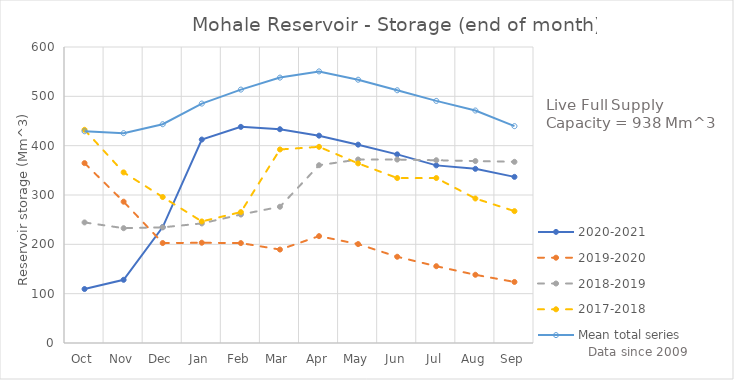
| Category | 2020-2021 | 2019-2020 | 2018-2019 | 2017-2018 | Mean total series |
|---|---|---|---|---|---|
| Oct | 109.398 | 364.62 | 244.4 | 432.2 | 429.191 |
| Nov | 128.09 | 286.44 | 232.72 | 345.81 | 425.328 |
| Dec | 234.9 | 202.634 | 234.46 | 295.88 | 443.469 |
| Jan | 412.4 | 203.248 | 242.39 | 246.4 | 485.354 |
| Feb | 438.1 | 202.5 | 260.39 | 265.37 | 513.687 |
| Mar | 433.3 | 189.42 | 276.2 | 392.3 | 537.97 |
| Apr | 420.3 | 216.61 | 360.36 | 397.62 | 550.532 |
| May | 402.05 | 200.49 | 371.95 | 364.09 | 533.685 |
| Jun | 382.38 | 174.82 | 371.82 | 334.4 | 512.314 |
| Jul | 360.03 | 155.66 | 370.46 | 334.4 | 490.738 |
| Aug | 353.04 | 138.3 | 368.84 | 292.92 | 471.239 |
| Sep | 336.74 | 123.732 | 367.23 | 267.3 | 439.559 |